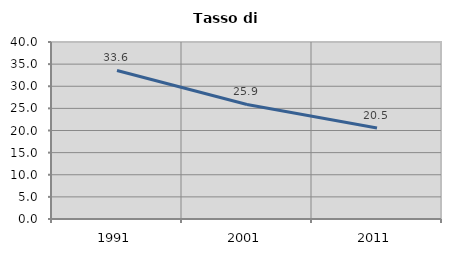
| Category | Tasso di disoccupazione   |
|---|---|
| 1991.0 | 33.569 |
| 2001.0 | 25.881 |
| 2011.0 | 20.544 |